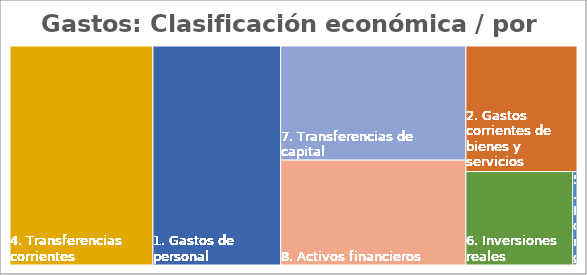
| Category | Series 0 |
|---|---|
| 1. Gastos de personal | 0.225 |
| 2. Gastos corrientes de bienes y servicios | 0.112 |
| 3. Gastos financieros | 0 |
| 4. Transferencias corrientes | 0.252 |
| 5. Fondo de contigencia y otros imprevistos | 0.003 |
| 6. Inversiones reales | 0.08 |
| 7. Transferencias de capital | 0.17 |
| 8. Activos financieros | 0.156 |